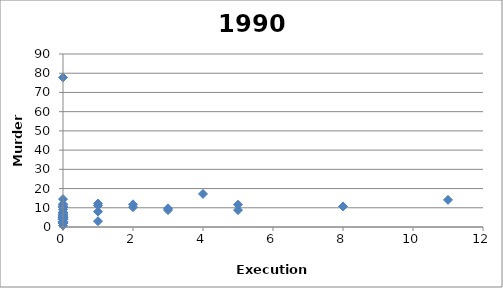
| Category | Series 0 |
|---|---|
| 5.0 | 11.6 |
| 0.0 | 7.5 |
| 0.0 | 7.7 |
| 2.0 | 10.3 |
| 0.0 | 11.9 |
| 0.0 | 4.2 |
| 0.0 | 5.1 |
| 0.0 | 5 |
| 0.0 | 77.8 |
| 8.0 | 10.7 |
| 2.0 | 11.8 |
| 0.0 | 4 |
| 0.0 | 2.7 |
| 0.0 | 10.3 |
| 0.0 | 6.2 |
| 0.0 | 1.9 |
| 0.0 | 4 |
| 0.0 | 7.2 |
| 4.0 | 17.2 |
| 0.0 | 2.4 |
| 0.0 | 11.5 |
| 0.0 | 4 |
| 0.0 | 10.4 |
| 0.0 | 2.7 |
| 1.0 | 12.2 |
| 5.0 | 8.8 |
| 0.0 | 4.9 |
| 0.0 | 2.7 |
| 3.0 | 9.7 |
| 0.0 | 1.9 |
| 0.0 | 5.6 |
| 0.0 | 9.2 |
| 0.0 | 14.5 |
| 0.0 | 10.7 |
| 0.0 | 0.8 |
| 0.0 | 6.1 |
| 1.0 | 8 |
| 0.0 | 3.8 |
| 0.0 | 6.7 |
| 0.0 | 4.8 |
| 1.0 | 11.2 |
| 0.0 | 2 |
| 0.0 | 10.5 |
| 11.0 | 14.1 |
| 1.0 | 3 |
| 0.0 | 2.3 |
| 3.0 | 8.8 |
| 0.0 | 4.9 |
| 0.0 | 5.7 |
| 0.0 | 4.6 |
| 0.0 | 4.9 |